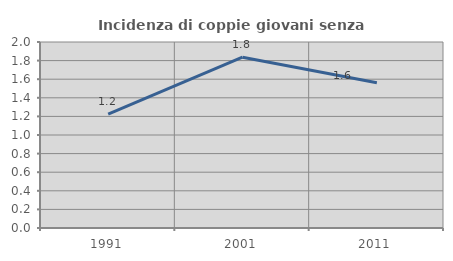
| Category | Incidenza di coppie giovani senza figli |
|---|---|
| 1991.0 | 1.224 |
| 2001.0 | 1.837 |
| 2011.0 | 1.562 |